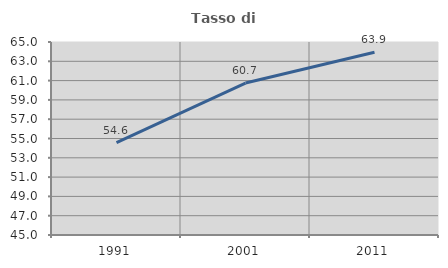
| Category | Tasso di occupazione   |
|---|---|
| 1991.0 | 54.565 |
| 2001.0 | 60.746 |
| 2011.0 | 63.936 |